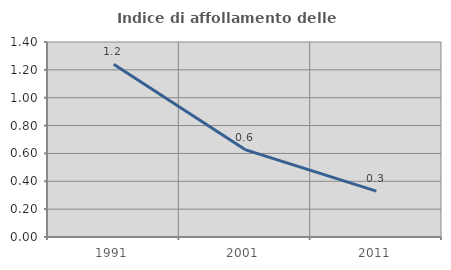
| Category | Indice di affollamento delle abitazioni  |
|---|---|
| 1991.0 | 1.24 |
| 2001.0 | 0.627 |
| 2011.0 | 0.329 |